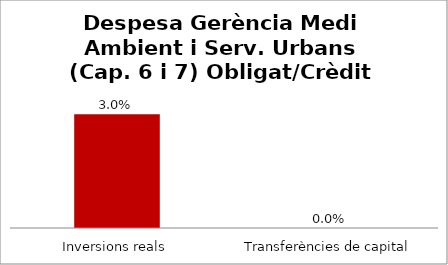
| Category | Series 0 |
|---|---|
| Inversions reals | 0.03 |
| Transferències de capital | 0 |